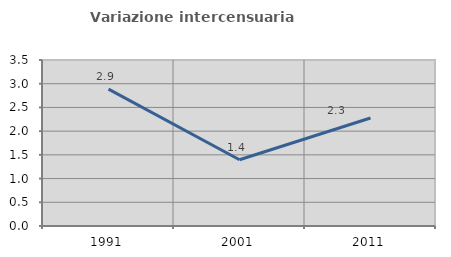
| Category | Variazione intercensuaria annua |
|---|---|
| 1991.0 | 2.886 |
| 2001.0 | 1.396 |
| 2011.0 | 2.277 |